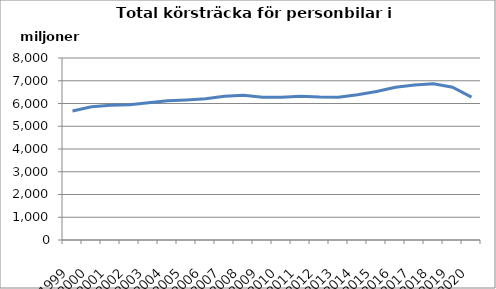
| Category | Series 0 |
|---|---|
| 1999.0 | 5670643852.1 |
| 2000.0 | 5855474348.2 |
| 2001.0 | 5921506460 |
| 2002.0 | 5943992726 |
| 2003.0 | 6037040610 |
| 2004.0 | 6125068678 |
| 2005.0 | 6158036407 |
| 2006.0 | 6207406936 |
| 2007.0 | 6319684828 |
| 2008.0 | 6367674932 |
| 2009.0 | 6272007118 |
| 2010.0 | 6271244185 |
| 2011.0 | 6322594571 |
| 2012.0 | 6280639665.7 |
| 2013.0 | 6278008025 |
| 2014.0 | 6381268446.7 |
| 2015.0 | 6531145878.4 |
| 2016.0 | 6717615860.5 |
| 2017.0 | 6808195546 |
| 2018.0 | 6866374264 |
| 2019.0 | 6714206425 |
| 2020.0 | 6282377816.2 |